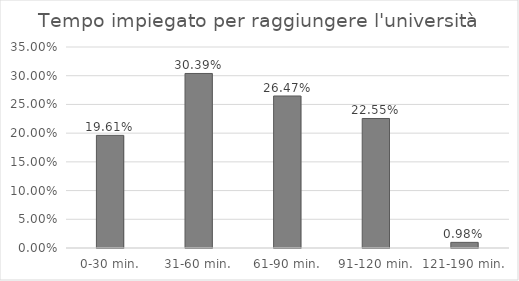
| Category | Percentuale  |
|---|---|
| 0-30 min. | 0.196 |
| 31-60 min. | 0.304 |
| 61-90 min. | 0.265 |
| 91-120 min. | 0.226 |
| 121-190 min. | 0.01 |